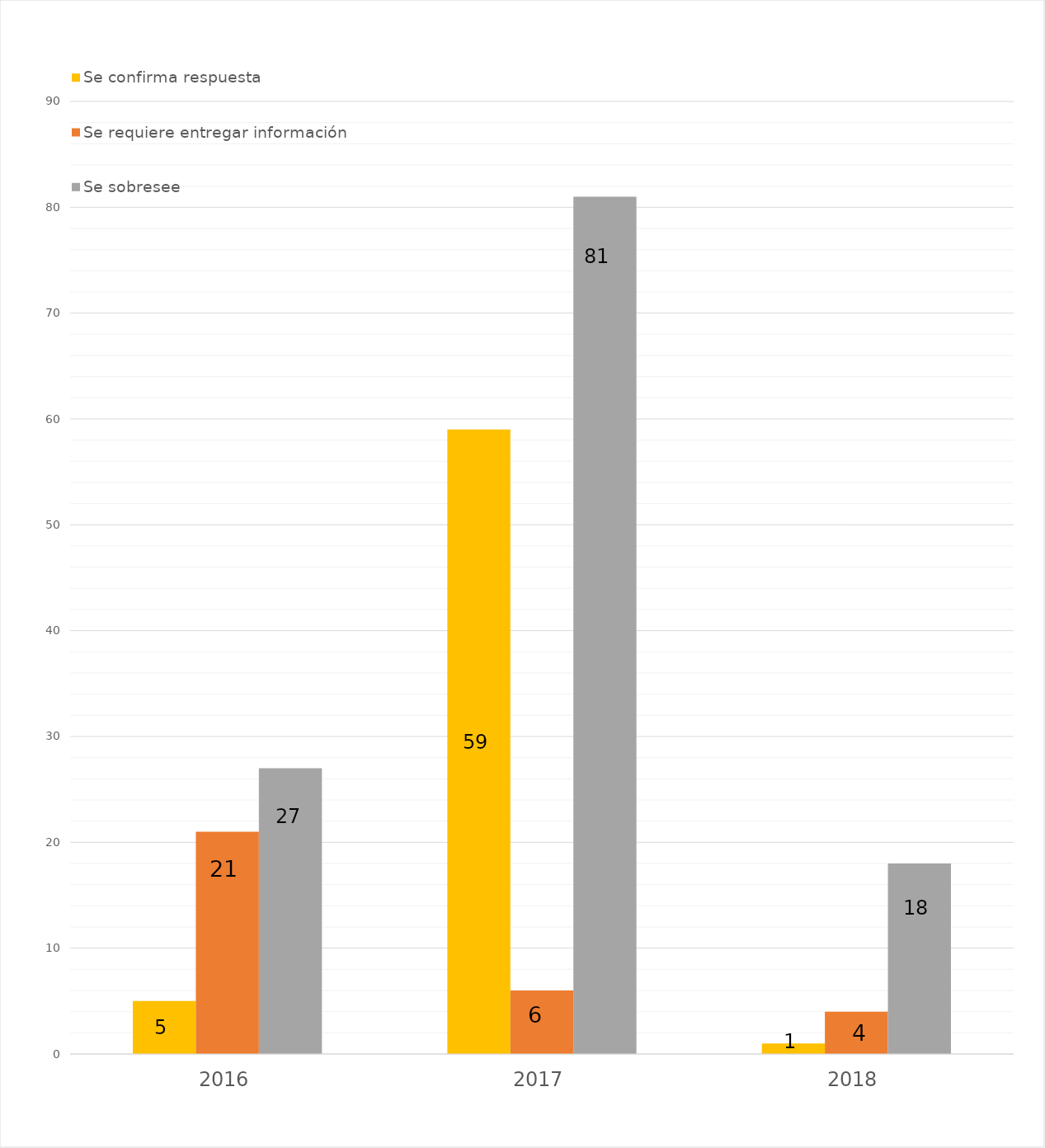
| Category | Se confirma respuesta | Se requiere entregar información  | Se sobresee  |
|---|---|---|---|
| 2016.0 | 5 | 21 | 27 |
| 2017.0 | 59 | 6 | 81 |
| 2018.0 | 1 | 4 | 18 |